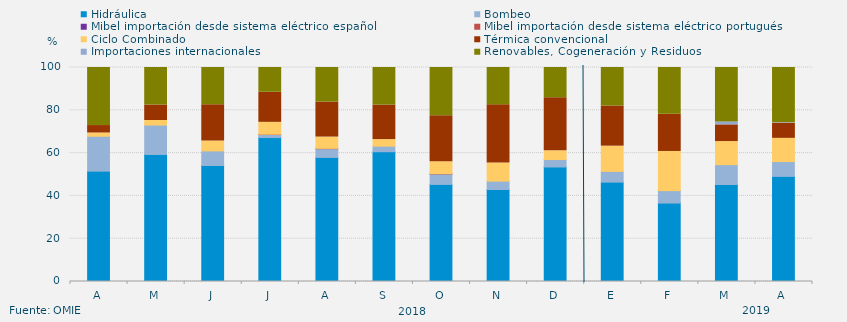
| Category | Hidráulica | Bombeo | Mibel importación desde sistema eléctrico español | Mibel importación desde sistema eléctrico portugués | Ciclo Combinado | Térmica convencional | Importaciones internacionales | Renovables, Cogeneración y Residuos |
|---|---|---|---|---|---|---|---|---|
| A | 51.574 | 16.296 | 0 | 0 | 1.528 | 3.472 | 0 | 27.13 |
| M | 59.364 | 13.732 | 0 | 0 | 2.128 | 7.236 | 0 | 17.54 |
| J | 54.213 | 6.806 | 0 | 0 | 4.63 | 16.944 | 0 | 17.407 |
| J | 67.272 | 1.411 | 0 | 0.134 | 5.556 | 14.068 | 0 | 11.559 |
| A | 57.975 | 4.099 | 0 | 0.134 | 5.287 | 16.331 | 0 | 16.174 |
| S | 60.637 | 2.616 | 0 | 0 | 3.067 | 16.1 | 0 | 17.581 |
| O | 45.363 | 4.906 | 0 | 0.134 | 5.578 | 21.438 | 0 | 22.581 |
| N | 42.998 | 3.9 | 0 | 0 | 8.472 | 27.187 | 0 | 17.442 |
| D | 53.517 | 3.472 | 0 | 0 | 4.077 | 24.798 | 0 | 14.135 |
| E | 46.427 | 5.029 | 0 | 0 | 11.794 | 18.75 | 0 | 18 |
| F | 36.657 | 5.804 | 0 | 0 | 18.304 | 17.386 | 0 | 21.85 |
| M | 45.334 | 9.275 | 0 | 0 | 10.778 | 7.806 | 1.38 | 25.426 |
| A | 49.12 | 6.921 | 0 | 0 | 10.856 | 7.014 | 0.255 | 25.833 |